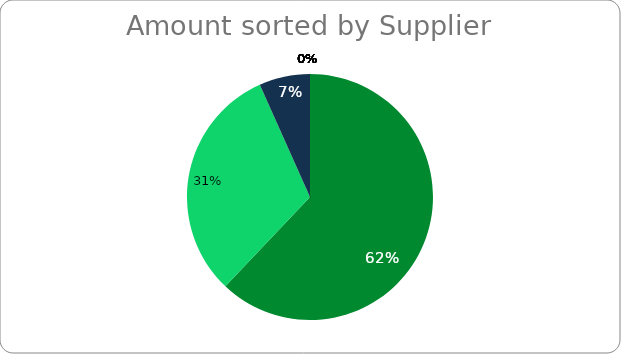
| Category | Series 0 |
|---|---|
| Supplier X | 4156 |
| Supplier Y | 2092 |
| Supplier Z | 448 |